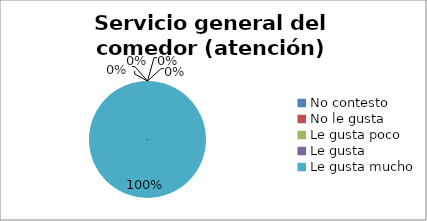
| Category | Series 0 |
|---|---|
| No contesto | 0 |
| No le gusta | 0 |
| Le gusta poco | 0 |
| Le gusta | 0 |
| Le gusta mucho | 6 |